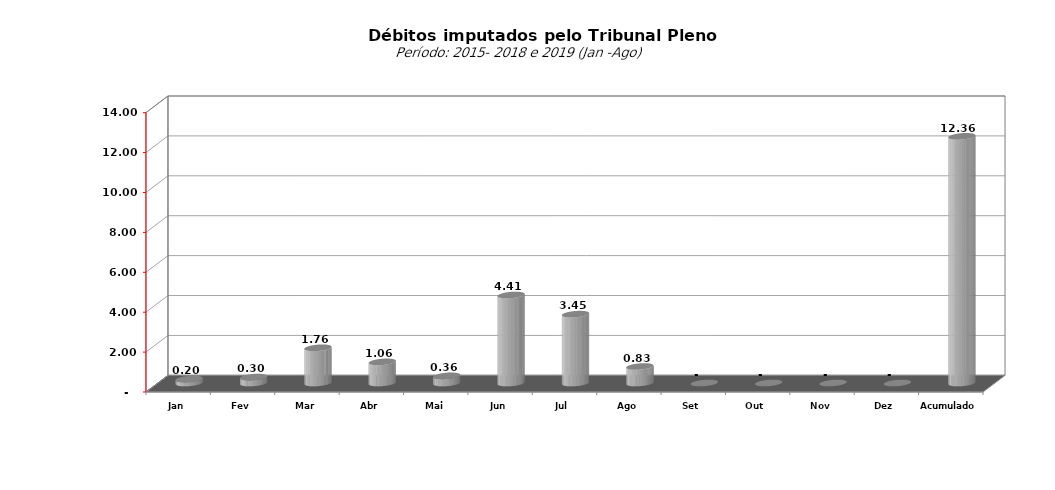
| Category |  7.073.154,74   5.749.129,25   4.727.033,51   16.081.820,48   21.535.723,60   8.578.266,09   25.676.499,17   10.592.915,18   197.255,77   296.375,09   1.764.671,00   1.058.511,33   358.973,08   4.409.150,19   3.450.817,21   826.867,37   -     -     -      |
|---|---|
| Jan | 197255.77 |
| Fev | 296375.09 |
| Mar | 1764671 |
| Abr | 1058511.33 |
| Mai | 358973.08 |
| Jun | 4409150.19 |
| Jul | 3450817.21 |
| Ago | 826867.37 |
| Set | 0 |
| Out | 0 |
| Nov | 0 |
| Dez | 0 |
| Acumulado | 12362621.04 |